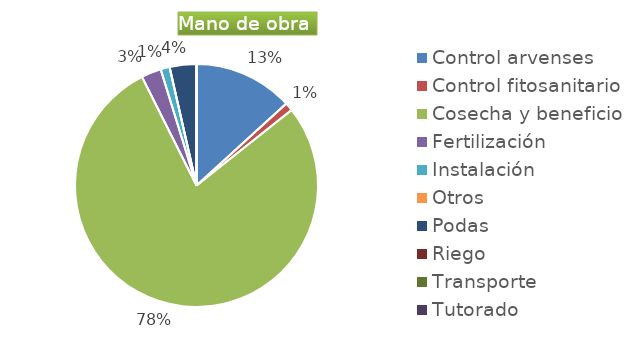
| Category | Series 0 |
|---|---|
| Control arvenses | 17941125 |
| Control fitosanitario | 1483133 |
| Cosecha y beneficio | 106177500 |
| Fertilización | 3588225 |
| Instalación | 1626662 |
| Otros | 0 |
| Podas | 4832143 |
| Riego | 0 |
| Transporte | 0 |
| Tutorado | 0 |